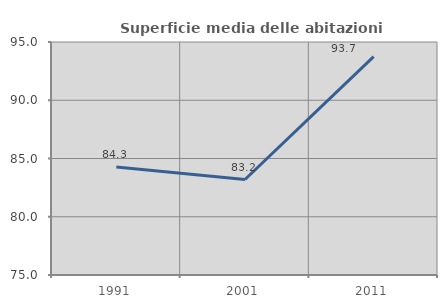
| Category | Superficie media delle abitazioni occupate |
|---|---|
| 1991.0 | 84.263 |
| 2001.0 | 83.195 |
| 2011.0 | 93.74 |